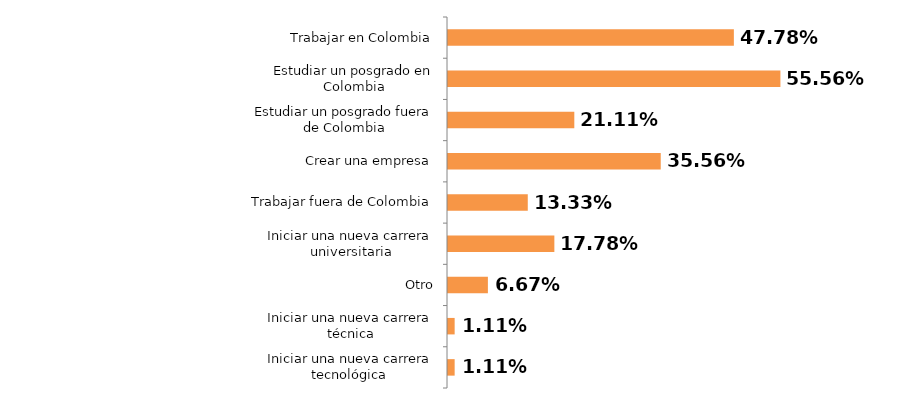
| Category | Series 0 |
|---|---|
| Iniciar una nueva carrera tecnológica  | 0.011 |
| Iniciar una nueva carrera técnica | 0.011 |
| Otro | 0.067 |
| Iniciar una nueva carrera universitaria | 0.178 |
| Trabajar fuera de Colombia | 0.133 |
| Crear una empresa | 0.356 |
| Estudiar un posgrado fuera de Colombia | 0.211 |
| Estudiar un posgrado en Colombia | 0.556 |
| Trabajar en Colombia | 0.478 |